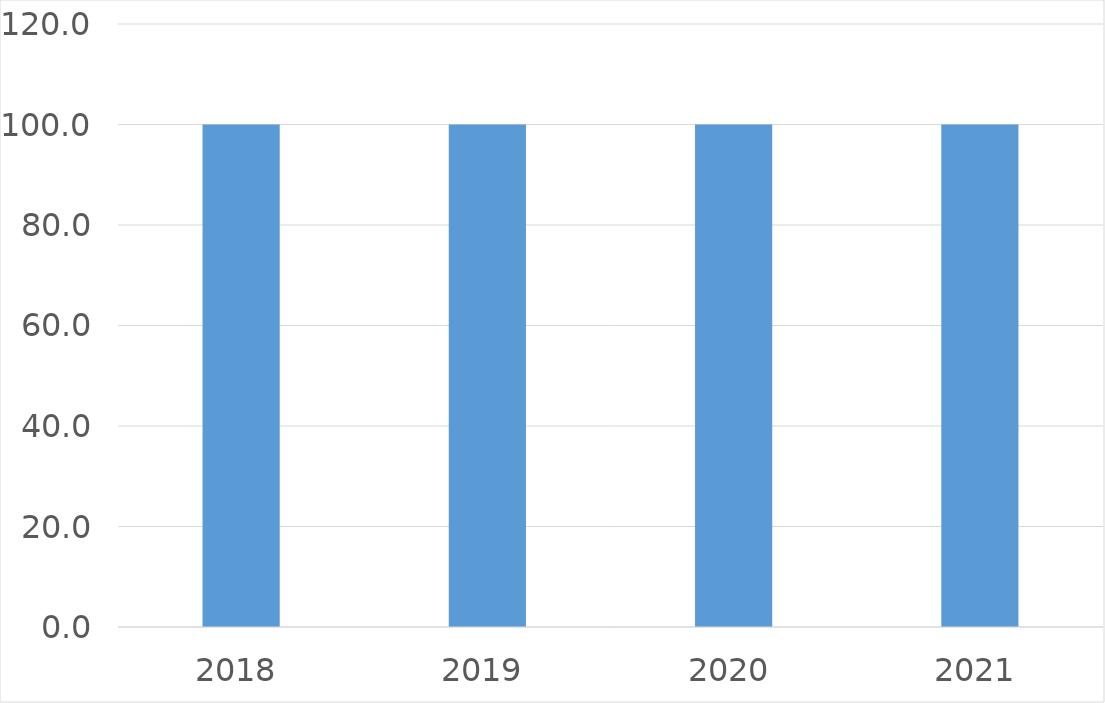
| Category | Series 0 |
|---|---|
| 2018 | 100 |
| 2019 | 100 |
| 2020 | 100 |
| 2021 | 100 |